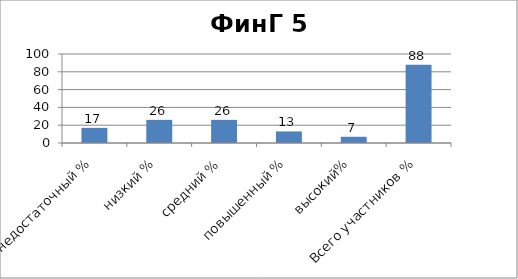
| Category | Series 0 |
|---|---|
| недостаточный % | 17 |
| низкий % | 26 |
| средний % | 26 |
| повышенный % | 13 |
| высокий% | 7 |
| Всего участников % | 88 |